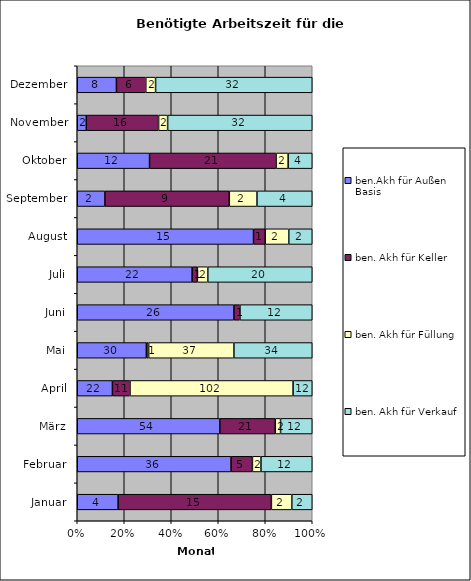
| Category | ben.Akh für Außen Basis | ben. Akh für Keller | ben. Akh für Füllung | ben. Akh für Verkauf |
|---|---|---|---|---|
| Januar | 4 | 15 | 2 | 2 |
| Februar | 36 | 5 | 2 | 12 |
| März | 54 | 21 | 2 | 12 |
| April | 22 | 11 | 102 | 12 |
| Mai | 30 | 1 | 37 | 34 |
| Juni | 26 | 1 | 0 | 12 |
| Juli | 22 | 1 | 2 | 20 |
| August | 15 | 1 | 2 | 2 |
| September | 2 | 9 | 2 | 4 |
| Oktober | 12 | 21 | 2 | 4 |
| November | 2 | 16 | 2 | 32 |
| Dezember | 8 | 6 | 2 | 32 |